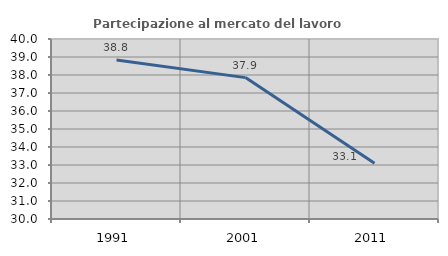
| Category | Partecipazione al mercato del lavoro  femminile |
|---|---|
| 1991.0 | 38.836 |
| 2001.0 | 37.855 |
| 2011.0 | 33.1 |